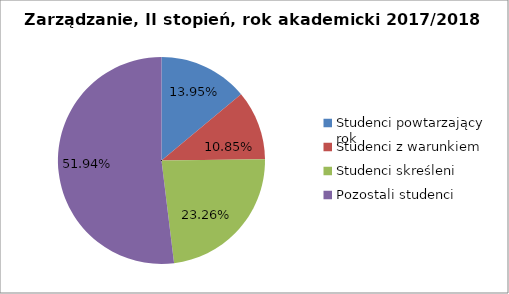
| Category | Series 0 |
|---|---|
| Studenci powtarzający rok | 18 |
| Studenci z warunkiem | 14 |
| Studenci skreśleni | 30 |
| Pozostali studenci | 67 |